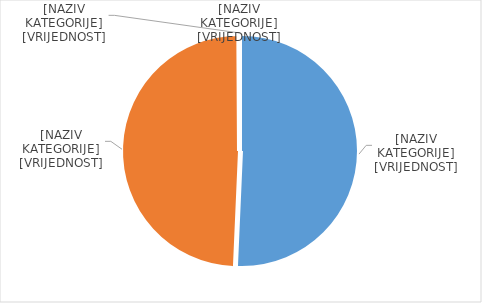
| Category | Series 0 |
|---|---|
| Poslani kreditni transferi   | 0.507 |
| Primljeni kreditni transferi  | 0.492 |
| Poslane novčane pošiljke  | 0 |
| Primljene novčane pošiljke  | 0.001 |